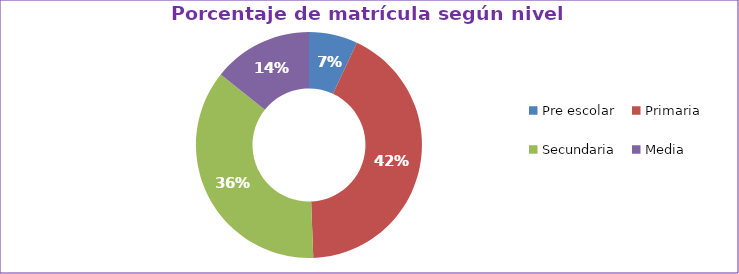
| Category | Series 0 |
|---|---|
| Pre escolar | 0.07 |
| Primaria | 0.424 |
| Secundaria | 0.363 |
| Media | 0.143 |